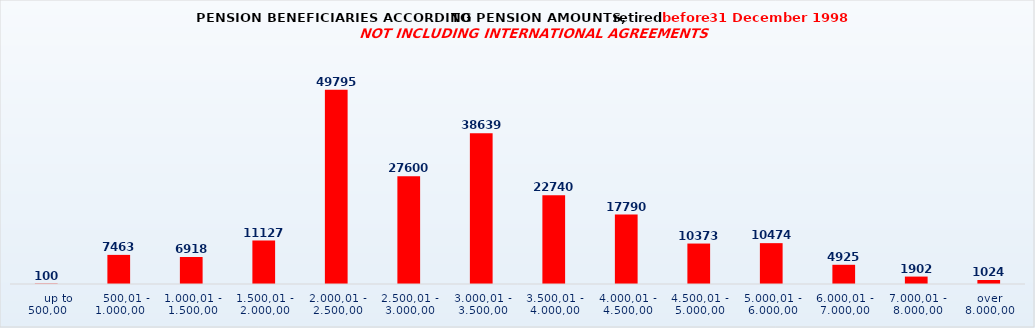
| Category | Series 0 |
|---|---|
|      up to 500,00 | 100 |
|    500,01 - 1.000,00 | 7463 |
| 1.000,01 - 1.500,00 | 6918 |
| 1.500,01 - 2.000,00 | 11127 |
| 2.000,01 - 2.500,00 | 49795 |
| 2.500,01 - 3.000,00 | 27600 |
| 3.000,01 - 3.500,00 | 38639 |
| 3.500,01 - 4.000,00 | 22740 |
| 4.000,01 - 4.500,00 | 17790 |
| 4.500,01 - 5.000,00 | 10373 |
| 5.000,01 - 6.000,00 | 10474 |
| 6.000,01 - 7.000,00 | 4925 |
| 7.000,01 - 8.000,00 | 1902 |
| over 8.000,00 | 1024 |